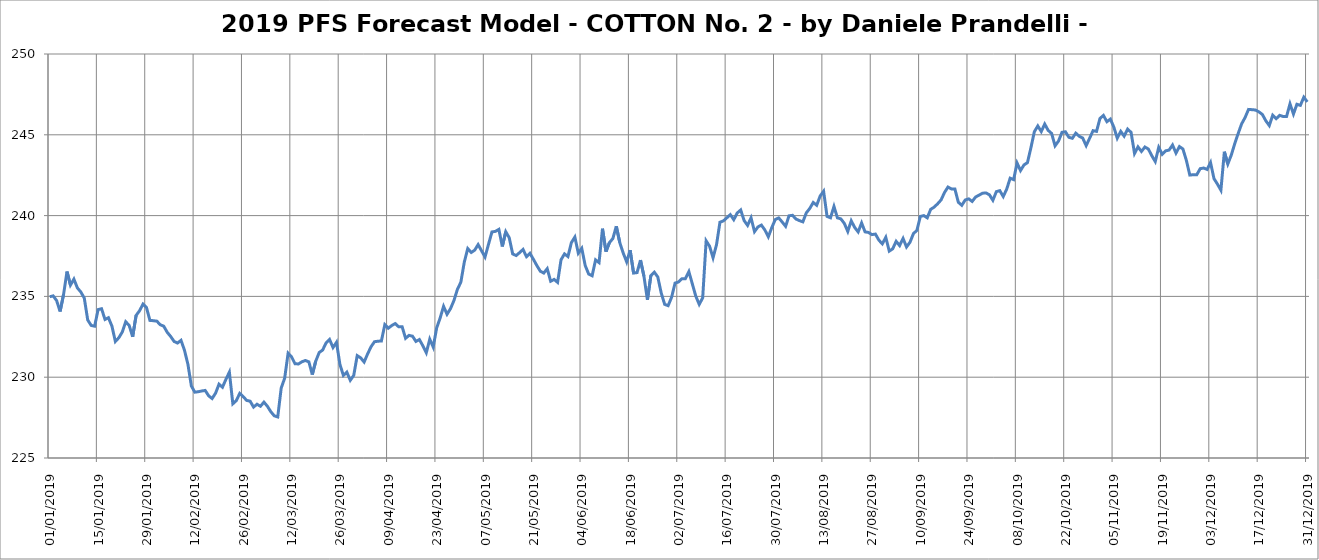
| Category | 2019 PFS Forecast Model - COTTON |
|---|---|
| 01/01/2019 | 234.981 |
| 02/01/2019 | 235.032 |
| 03/01/2019 | 234.739 |
| 04/01/2019 | 234.066 |
| 05/01/2019 | 235.111 |
| 06/01/2019 | 236.536 |
| 07/01/2019 | 235.701 |
| 08/01/2019 | 236.069 |
| 09/01/2019 | 235.526 |
| 10/01/2019 | 235.274 |
| 11/01/2019 | 234.895 |
| 12/01/2019 | 233.539 |
| 13/01/2019 | 233.202 |
| 14/01/2019 | 233.158 |
| 15/01/2019 | 234.182 |
| 16/01/2019 | 234.239 |
| 17/01/2019 | 233.573 |
| 18/01/2019 | 233.678 |
| 19/01/2019 | 233.163 |
| 20/01/2019 | 232.211 |
| 21/01/2019 | 232.442 |
| 22/01/2019 | 232.798 |
| 23/01/2019 | 233.431 |
| 24/01/2019 | 233.199 |
| 25/01/2019 | 232.502 |
| 26/01/2019 | 233.822 |
| 27/01/2019 | 234.111 |
| 28/01/2019 | 234.523 |
| 29/01/2019 | 234.316 |
| 30/01/2019 | 233.515 |
| 31/01/2019 | 233.496 |
| 01/02/2019 | 233.468 |
| 02/02/2019 | 233.246 |
| 03/02/2019 | 233.157 |
| 04/02/2019 | 232.781 |
| 05/02/2019 | 232.522 |
| 06/02/2019 | 232.213 |
| 07/02/2019 | 232.114 |
| 08/02/2019 | 232.282 |
| 09/02/2019 | 231.669 |
| 10/02/2019 | 230.797 |
| 11/02/2019 | 229.452 |
| 12/02/2019 | 229.074 |
| 13/02/2019 | 229.102 |
| 14/02/2019 | 229.147 |
| 15/02/2019 | 229.18 |
| 16/02/2019 | 228.848 |
| 17/02/2019 | 228.68 |
| 18/02/2019 | 229.007 |
| 19/02/2019 | 229.567 |
| 20/02/2019 | 229.379 |
| 21/02/2019 | 229.867 |
| 22/02/2019 | 230.314 |
| 23/02/2019 | 228.355 |
| 24/02/2019 | 228.548 |
| 25/02/2019 | 228.999 |
| 26/02/2019 | 228.798 |
| 27/02/2019 | 228.564 |
| 28/02/2019 | 228.516 |
| 01/03/2019 | 228.152 |
| 02/03/2019 | 228.327 |
| 03/03/2019 | 228.201 |
| 04/03/2019 | 228.457 |
| 05/03/2019 | 228.204 |
| 06/03/2019 | 227.864 |
| 07/03/2019 | 227.608 |
| 08/03/2019 | 227.541 |
| 09/03/2019 | 229.328 |
| 10/03/2019 | 229.936 |
| 11/03/2019 | 231.484 |
| 12/03/2019 | 231.258 |
| 13/03/2019 | 230.831 |
| 14/03/2019 | 230.821 |
| 15/03/2019 | 230.955 |
| 16/03/2019 | 231.034 |
| 17/03/2019 | 230.951 |
| 18/03/2019 | 230.164 |
| 19/03/2019 | 230.995 |
| 20/03/2019 | 231.527 |
| 21/03/2019 | 231.681 |
| 22/03/2019 | 232.126 |
| 23/03/2019 | 232.335 |
| 24/03/2019 | 231.837 |
| 25/03/2019 | 232.159 |
| 26/03/2019 | 230.789 |
| 27/03/2019 | 230.108 |
| 28/03/2019 | 230.311 |
| 29/03/2019 | 229.808 |
| 30/03/2019 | 230.115 |
| 31/03/2019 | 231.335 |
| 01/04/2019 | 231.199 |
| 02/04/2019 | 230.938 |
| 03/04/2019 | 231.432 |
| 04/04/2019 | 231.883 |
| 05/04/2019 | 232.195 |
| 06/04/2019 | 232.227 |
| 07/04/2019 | 232.24 |
| 08/04/2019 | 233.253 |
| 09/04/2019 | 233.032 |
| 10/04/2019 | 233.197 |
| 11/04/2019 | 233.319 |
| 12/04/2019 | 233.122 |
| 13/04/2019 | 233.127 |
| 14/04/2019 | 232.407 |
| 15/04/2019 | 232.588 |
| 16/04/2019 | 232.539 |
| 17/04/2019 | 232.214 |
| 18/04/2019 | 232.33 |
| 19/04/2019 | 231.945 |
| 20/04/2019 | 231.514 |
| 21/04/2019 | 232.351 |
| 22/04/2019 | 231.866 |
| 23/04/2019 | 233.049 |
| 24/04/2019 | 233.66 |
| 25/04/2019 | 234.384 |
| 26/04/2019 | 233.894 |
| 27/04/2019 | 234.239 |
| 28/04/2019 | 234.745 |
| 29/04/2019 | 235.431 |
| 30/04/2019 | 235.88 |
| 01/05/2019 | 237.123 |
| 02/05/2019 | 237.962 |
| 03/05/2019 | 237.719 |
| 04/05/2019 | 237.859 |
| 05/05/2019 | 238.206 |
| 06/05/2019 | 237.822 |
| 07/05/2019 | 237.437 |
| 08/05/2019 | 238.221 |
| 09/05/2019 | 238.989 |
| 10/05/2019 | 239.023 |
| 11/05/2019 | 239.147 |
| 12/05/2019 | 238.088 |
| 13/05/2019 | 239.003 |
| 14/05/2019 | 238.631 |
| 15/05/2019 | 237.632 |
| 16/05/2019 | 237.527 |
| 17/05/2019 | 237.708 |
| 18/05/2019 | 237.907 |
| 19/05/2019 | 237.459 |
| 20/05/2019 | 237.664 |
| 21/05/2019 | 237.296 |
| 22/05/2019 | 236.909 |
| 23/05/2019 | 236.559 |
| 24/05/2019 | 236.445 |
| 25/05/2019 | 236.715 |
| 26/05/2019 | 235.938 |
| 27/05/2019 | 236.051 |
| 28/05/2019 | 235.868 |
| 29/05/2019 | 237.267 |
| 30/05/2019 | 237.631 |
| 31/05/2019 | 237.466 |
| 01/06/2019 | 238.331 |
| 02/06/2019 | 238.671 |
| 03/06/2019 | 237.674 |
| 04/06/2019 | 237.977 |
| 05/06/2019 | 236.907 |
| 06/06/2019 | 236.383 |
| 07/06/2019 | 236.279 |
| 08/06/2019 | 237.26 |
| 09/06/2019 | 237.092 |
| 10/06/2019 | 239.189 |
| 11/06/2019 | 237.771 |
| 12/06/2019 | 238.325 |
| 13/06/2019 | 238.581 |
| 14/06/2019 | 239.342 |
| 15/06/2019 | 238.333 |
| 16/06/2019 | 237.681 |
| 17/06/2019 | 237.136 |
| 18/06/2019 | 237.862 |
| 19/06/2019 | 236.443 |
| 20/06/2019 | 236.473 |
| 21/06/2019 | 237.244 |
| 22/06/2019 | 236.248 |
| 23/06/2019 | 234.784 |
| 24/06/2019 | 236.286 |
| 25/06/2019 | 236.497 |
| 26/06/2019 | 236.203 |
| 27/06/2019 | 235.21 |
| 28/06/2019 | 234.506 |
| 29/06/2019 | 234.428 |
| 30/06/2019 | 234.944 |
| 01/07/2019 | 235.821 |
| 02/07/2019 | 235.896 |
| 03/07/2019 | 236.096 |
| 04/07/2019 | 236.096 |
| 05/07/2019 | 236.531 |
| 06/07/2019 | 235.776 |
| 07/07/2019 | 235.018 |
| 08/07/2019 | 234.507 |
| 09/07/2019 | 234.908 |
| 10/07/2019 | 238.438 |
| 11/07/2019 | 238.101 |
| 12/07/2019 | 237.391 |
| 13/07/2019 | 238.198 |
| 14/07/2019 | 239.591 |
| 15/07/2019 | 239.672 |
| 16/07/2019 | 239.867 |
| 17/07/2019 | 240.06 |
| 18/07/2019 | 239.748 |
| 19/07/2019 | 240.16 |
| 20/07/2019 | 240.348 |
| 21/07/2019 | 239.691 |
| 22/07/2019 | 239.394 |
| 23/07/2019 | 239.861 |
| 24/07/2019 | 239.008 |
| 25/07/2019 | 239.301 |
| 26/07/2019 | 239.412 |
| 27/07/2019 | 239.109 |
| 28/07/2019 | 238.691 |
| 29/07/2019 | 239.254 |
| 30/07/2019 | 239.754 |
| 31/07/2019 | 239.858 |
| 01/08/2019 | 239.608 |
| 02/08/2019 | 239.338 |
| 03/08/2019 | 239.988 |
| 04/08/2019 | 240.018 |
| 05/08/2019 | 239.788 |
| 06/08/2019 | 239.689 |
| 07/08/2019 | 239.615 |
| 08/08/2019 | 240.172 |
| 09/08/2019 | 240.443 |
| 10/08/2019 | 240.813 |
| 11/08/2019 | 240.64 |
| 12/08/2019 | 241.211 |
| 13/08/2019 | 241.507 |
| 14/08/2019 | 239.949 |
| 15/08/2019 | 239.865 |
| 16/08/2019 | 240.567 |
| 17/08/2019 | 239.862 |
| 18/08/2019 | 239.796 |
| 19/08/2019 | 239.517 |
| 20/08/2019 | 239.02 |
| 21/08/2019 | 239.676 |
| 22/08/2019 | 239.267 |
| 23/08/2019 | 238.991 |
| 24/08/2019 | 239.547 |
| 25/08/2019 | 238.992 |
| 26/08/2019 | 238.957 |
| 27/08/2019 | 238.823 |
| 28/08/2019 | 238.858 |
| 29/08/2019 | 238.48 |
| 30/08/2019 | 238.251 |
| 31/08/2019 | 238.656 |
| 01/09/2019 | 237.801 |
| 02/09/2019 | 237.947 |
| 03/09/2019 | 238.409 |
| 04/09/2019 | 238.145 |
| 05/09/2019 | 238.587 |
| 06/09/2019 | 238.059 |
| 07/09/2019 | 238.347 |
| 08/09/2019 | 238.886 |
| 09/09/2019 | 239.085 |
| 10/09/2019 | 239.946 |
| 11/09/2019 | 240.002 |
| 12/09/2019 | 239.863 |
| 13/09/2019 | 240.39 |
| 14/09/2019 | 240.523 |
| 15/09/2019 | 240.73 |
| 16/09/2019 | 240.968 |
| 17/09/2019 | 241.431 |
| 18/09/2019 | 241.766 |
| 19/09/2019 | 241.651 |
| 20/09/2019 | 241.649 |
| 21/09/2019 | 240.825 |
| 22/09/2019 | 240.638 |
| 23/09/2019 | 240.968 |
| 24/09/2019 | 241.035 |
| 25/09/2019 | 240.876 |
| 26/09/2019 | 241.152 |
| 27/09/2019 | 241.265 |
| 28/09/2019 | 241.386 |
| 29/09/2019 | 241.403 |
| 30/09/2019 | 241.287 |
| 01/10/2019 | 240.946 |
| 02/10/2019 | 241.482 |
| 03/10/2019 | 241.544 |
| 04/10/2019 | 241.18 |
| 05/10/2019 | 241.638 |
| 06/10/2019 | 242.315 |
| 07/10/2019 | 242.226 |
| 08/10/2019 | 243.254 |
| 09/10/2019 | 242.788 |
| 10/10/2019 | 243.135 |
| 11/10/2019 | 243.277 |
| 12/10/2019 | 244.191 |
| 13/10/2019 | 245.19 |
| 14/10/2019 | 245.548 |
| 15/10/2019 | 245.201 |
| 16/10/2019 | 245.665 |
| 17/10/2019 | 245.275 |
| 18/10/2019 | 245.084 |
| 19/10/2019 | 244.32 |
| 20/10/2019 | 244.615 |
| 21/10/2019 | 245.154 |
| 22/10/2019 | 245.188 |
| 23/10/2019 | 244.844 |
| 24/10/2019 | 244.785 |
| 25/10/2019 | 245.101 |
| 26/10/2019 | 244.908 |
| 27/10/2019 | 244.8 |
| 28/10/2019 | 244.33 |
| 29/10/2019 | 244.787 |
| 30/10/2019 | 245.256 |
| 31/10/2019 | 245.212 |
| 01/11/2019 | 246.013 |
| 02/11/2019 | 246.199 |
| 03/11/2019 | 245.811 |
| 04/11/2019 | 245.972 |
| 05/11/2019 | 245.48 |
| 06/11/2019 | 244.792 |
| 07/11/2019 | 245.213 |
| 08/11/2019 | 244.915 |
| 09/11/2019 | 245.35 |
| 10/11/2019 | 245.151 |
| 11/11/2019 | 243.843 |
| 12/11/2019 | 244.251 |
| 13/11/2019 | 243.969 |
| 14/11/2019 | 244.244 |
| 15/11/2019 | 244.12 |
| 16/11/2019 | 243.704 |
| 17/11/2019 | 243.345 |
| 18/11/2019 | 244.221 |
| 19/11/2019 | 243.797 |
| 20/11/2019 | 244.006 |
| 21/11/2019 | 244.055 |
| 22/11/2019 | 244.367 |
| 23/11/2019 | 243.871 |
| 24/11/2019 | 244.271 |
| 25/11/2019 | 244.122 |
| 26/11/2019 | 243.419 |
| 27/11/2019 | 242.508 |
| 28/11/2019 | 242.532 |
| 29/11/2019 | 242.525 |
| 30/11/2019 | 242.903 |
| 01/12/2019 | 242.944 |
| 02/12/2019 | 242.858 |
| 03/12/2019 | 243.284 |
| 04/12/2019 | 242.287 |
| 05/12/2019 | 241.947 |
| 06/12/2019 | 241.572 |
| 07/12/2019 | 243.952 |
| 08/12/2019 | 243.194 |
| 09/12/2019 | 243.742 |
| 10/12/2019 | 244.447 |
| 11/12/2019 | 245.081 |
| 12/12/2019 | 245.676 |
| 13/12/2019 | 246.07 |
| 14/12/2019 | 246.571 |
| 15/12/2019 | 246.555 |
| 16/12/2019 | 246.534 |
| 17/12/2019 | 246.418 |
| 18/12/2019 | 246.259 |
| 19/12/2019 | 245.868 |
| 20/12/2019 | 245.573 |
| 21/12/2019 | 246.208 |
| 22/12/2019 | 245.997 |
| 23/12/2019 | 246.205 |
| 24/12/2019 | 246.13 |
| 25/12/2019 | 246.13 |
| 26/12/2019 | 246.917 |
| 27/12/2019 | 246.284 |
| 28/12/2019 | 246.892 |
| 29/12/2019 | 246.821 |
| 30/12/2019 | 247.327 |
| 31/12/2019 | 247.036 |